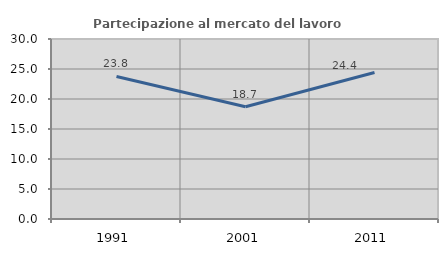
| Category | Partecipazione al mercato del lavoro  femminile |
|---|---|
| 1991.0 | 23.758 |
| 2001.0 | 18.697 |
| 2011.0 | 24.423 |